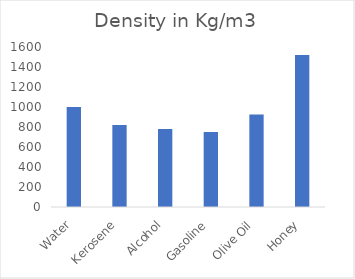
| Category | Density in Kg/m3 |
|---|---|
| Water | 1000 |
| Kerosene | 820 |
| Alcohol | 780 |
| Gasoline | 750 |
| Olive Oil | 925 |
| Honey | 1520 |